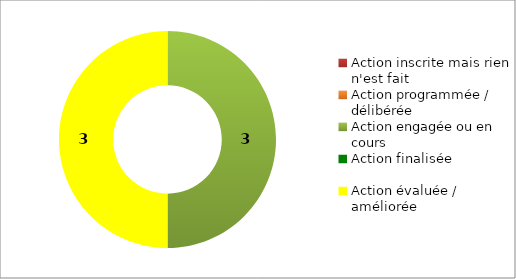
| Category | Series 0 |
|---|---|
| Action inscrite mais rien n'est fait | 0 |
| Action programmée / délibérée | 0 |
| Action engagée ou en cours | 3 |
| Action finalisée | 0 |
| Action évaluée / améliorée | 3 |